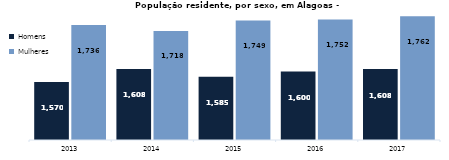
| Category | Homens | Mulheres |
|---|---|---|
| 2013.0 | 1569.707 | 1736.093 |
| 2014.0 | 1607.658 | 1718.342 |
| 2015.0 | 1584.853 | 1749.197 |
| 2016.0 | 1600.233 | 1751.961 |
| 2017.0 | 1607.597 | 1761.586 |